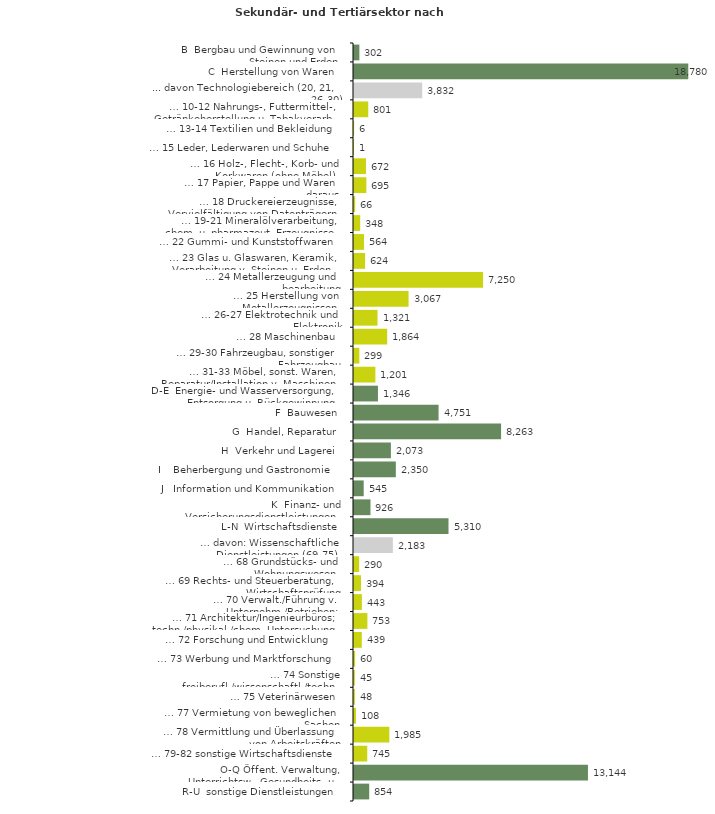
| Category | Series 0 |
|---|---|
| B  Bergbau und Gewinnung von Steinen und Erden | 302 |
| C  Herstellung von Waren | 18780 |
| ... davon Technologiebereich (20, 21, 26-30) | 3832 |
| … 10-12 Nahrungs-, Futtermittel-, Getränkeherstellung u. Tabakverarb. | 801 |
| … 13-14 Textilien und Bekleidung | 6 |
| … 15 Leder, Lederwaren und Schuhe | 1 |
| … 16 Holz-, Flecht-, Korb- und Korkwaren (ohne Möbel)  | 672 |
| … 17 Papier, Pappe und Waren daraus  | 695 |
| … 18 Druckereierzeugnisse, Vervielfältigung von Datenträgern | 66 |
| … 19-21 Mineralölverarbeitung, chem. u. pharmazeut. Erzeugnisse | 348 |
| … 22 Gummi- und Kunststoffwaren | 564 |
| … 23 Glas u. Glaswaren, Keramik, Verarbeitung v. Steinen u. Erden  | 624 |
| … 24 Metallerzeugung und -bearbeitung | 7250 |
| … 25 Herstellung von Metallerzeugnissen  | 3067 |
| … 26-27 Elektrotechnik und Elektronik | 1321 |
| … 28 Maschinenbau | 1864 |
| … 29-30 Fahrzeugbau, sonstiger Fahrzeugbau | 299 |
| … 31-33 Möbel, sonst. Waren, Reparatur/Installation v. Maschinen | 1201 |
| D-E  Energie- und Wasserversorgung, Entsorgung u. Rückgewinnung | 1346 |
| F  Bauwesen | 4751 |
| G  Handel, Reparatur | 8263 |
| H  Verkehr und Lagerei | 2073 |
| I    Beherbergung und Gastronomie | 2350 |
| J   Information und Kommunikation | 545 |
| K  Finanz- und Versicherungsdienstleistungen | 926 |
| L-N  Wirtschaftsdienste | 5310 |
| … davon: Wissenschaftliche Dienstleistungen (69-75) | 2183 |
| … 68 Grundstücks- und Wohnungswesen  | 290 |
| … 69 Rechts- und Steuerberatung, Wirtschaftsprüfung | 394 |
| … 70 Verwalt./Führung v. Unternehm./Betrieben; Unternehmensberat. | 443 |
| … 71 Architektur/Ingenieurbüros; techn./physikal./chem. Untersuchung | 753 |
| … 72 Forschung und Entwicklung  | 439 |
| … 73 Werbung und Marktforschung | 60 |
| … 74 Sonstige freiberufl./wissenschaftl./techn. Tätigkeiten | 45 |
| … 75 Veterinärwesen | 48 |
| … 77 Vermietung von beweglichen Sachen  | 108 |
| … 78 Vermittlung und Überlassung von Arbeitskräften | 1985 |
| … 79-82 sonstige Wirtschaftsdienste | 745 |
| O-Q Öffent. Verwaltung, Unterrichtsw., Gesundheits- u. Sozialwesen | 13144 |
| R-U  sonstige Dienstleistungen | 854 |